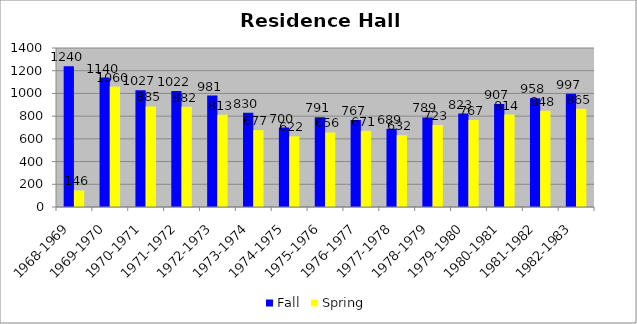
| Category | Fall | Spring |
|---|---|---|
| 1968-1969 | 1240 | 146 |
| 1969-1970 | 1140 | 1060 |
| 1970-1971 | 1027 | 885 |
| 1971-1972 | 1022 | 882 |
| 1972-1973 | 981 | 813 |
| 1973-1974 | 830 | 677 |
| 1974-1975 | 700 | 622 |
| 1975-1976 | 791 | 656 |
| 1976-1977 | 767 | 671 |
| 1977-1978 | 689 | 632 |
| 1978-1979 | 789 | 723 |
| 1979-1980 | 823 | 767 |
| 1980-1981 | 907 | 814 |
| 1981-1982 | 958 | 848 |
| 1982-1983 | 997 | 865 |